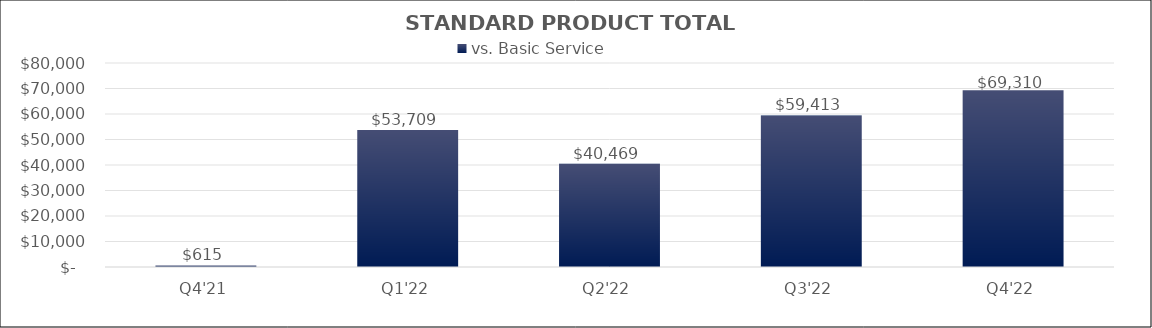
| Category | vs. Basic Service |
|---|---|
| Q4'21 | 615.307 |
| Q1'22 | 53708.915 |
| Q2'22 | 40469.084 |
| Q3'22 | 59413.17 |
| Q4'22 | 69310.466 |